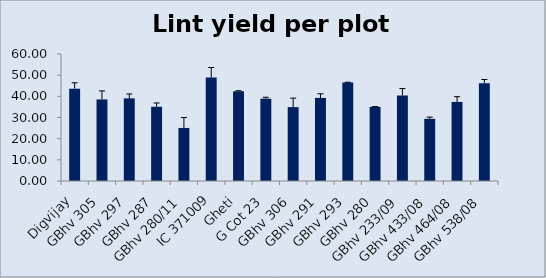
| Category | Lint yield per plot (g) |
|---|---|
| Digvijay | 43.63 |
| GBhv 305 | 38.535 |
| GBhv 297 | 39.045 |
| GBhv 287 | 35.08 |
| GBhv 280/11 | 25.065 |
| IC 371009 | 48.885 |
| Gheti | 42.44 |
| G Cot 23 | 38.9 |
| GBhv 306 | 34.905 |
| GBhv 291 | 39.26 |
| GBhv 293 | 46.5 |
| GBhv 280 | 35.045 |
| GBhv 233/09 | 40.43 |
| GBhv 433/08 | 29.375 |
| GBhv 464/08 | 37.36 |
| GBhv 538/08 | 46.21 |